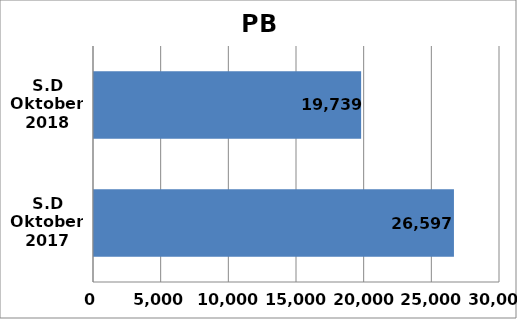
| Category | Series 0 |
|---|---|
| S.D Oktober 2017 | 26597 |
| S.D Oktober 2018 | 19739 |